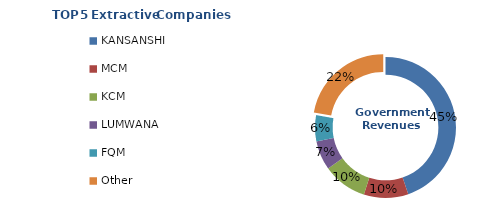
| Category | Series 0 |
|---|---|
| KANSANSHI | 0.448 |
| MCM | 0.102 |
| KCM | 0.102 |
| LUMWANA | 0.067 |
| FQM | 0.06 |
| Other | 0.222 |